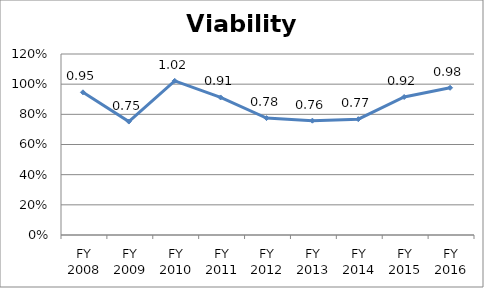
| Category | Viability ratio |
|---|---|
| FY 2016 | 0.976 |
| FY 2015 | 0.915 |
| FY 2014 | 0.768 |
| FY 2013 | 0.758 |
| FY 2012 | 0.775 |
| FY 2011 | 0.912 |
| FY 2010 | 1.022 |
| FY 2009 | 0.752 |
| FY 2008 | 0.946 |